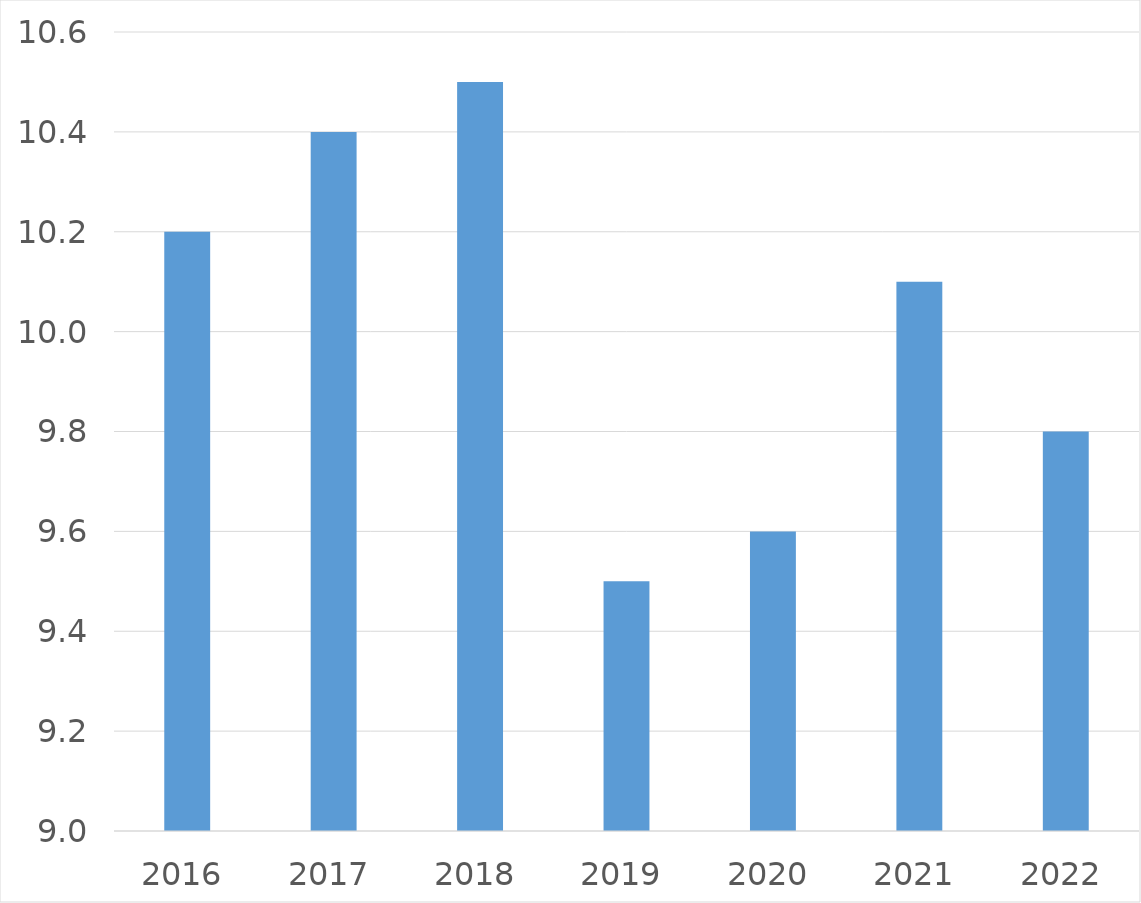
| Category | Series 0 |
|---|---|
| 2016 | 10.2 |
| 2017 | 10.4 |
| 2018 | 10.5 |
| 2019 | 9.5 |
| 2020 | 9.6 |
| 2021 | 10.1 |
| 2022 | 9.8 |